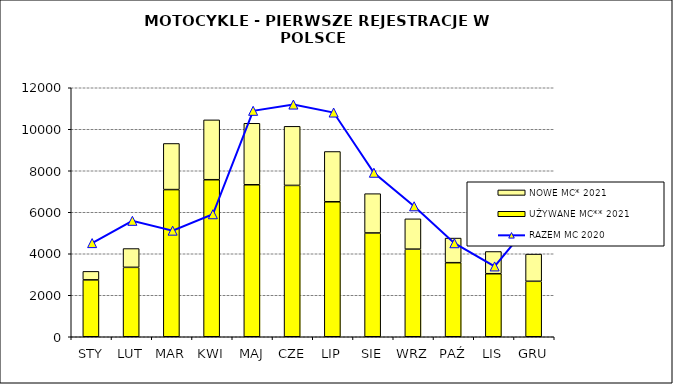
| Category | UŻYWANE MC** 2021 | NOWE MC* 2021 |
|---|---|---|
| STY | 2741 | 410 |
| LUT | 3345 | 906 |
| MAR | 7092 | 2223 |
| KWI | 7568 | 2884 |
| MAJ | 7325 | 2963 |
| CZE | 7293 | 2848 |
| LIP | 6505 | 2423 |
| SIE | 5002 | 1894 |
| WRZ | 4222 | 1461 |
| PAŹ | 3570 | 1186 |
| LIS | 3038 | 1071 |
| GRU | 2673 | 1310 |